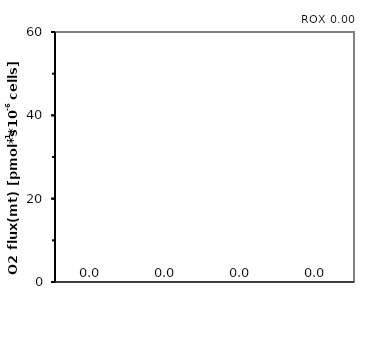
| Category | ROX 0,00 |
|---|---|
|  | 0 |
|  | 0 |
|  | 0 |
|  | 0 |